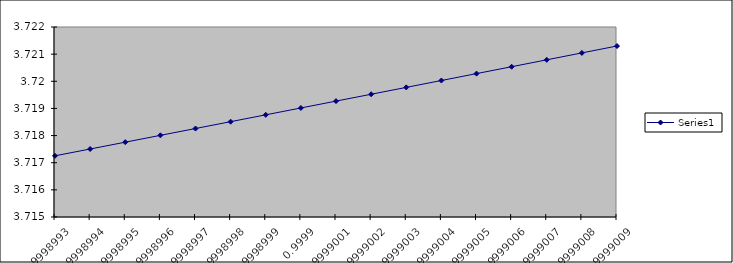
| Category | Series 0 |
|---|---|
| 0.9998993000000808 | 3.717 |
| 0.9998994000000807 | 3.718 |
| 0.9998995000000807 | 3.718 |
| 0.9998996000000806 | 3.718 |
| 0.9998997000000805 | 3.718 |
| 0.9998998000000805 | 3.719 |
| 0.9998999000000804 | 3.719 |
| 0.9999000000000804 | 3.719 |
| 0.9999001000000803 | 3.719 |
| 0.9999002000000803 | 3.72 |
| 0.9999003000000802 | 3.72 |
| 0.9999004000000802 | 3.72 |
| 0.9999005000000801 | 3.72 |
| 0.9999006000000801 | 3.721 |
| 0.99990070000008 | 3.721 |
| 0.99990080000008 | 3.721 |
| 0.9999009000000799 | 3.721 |